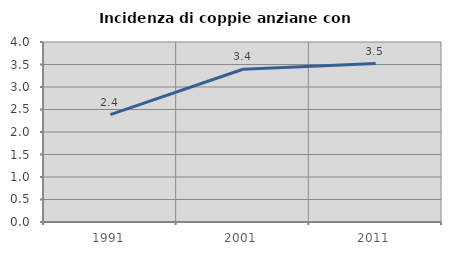
| Category | Incidenza di coppie anziane con figli |
|---|---|
| 1991.0 | 2.387 |
| 2001.0 | 3.394 |
| 2011.0 | 3.52 |